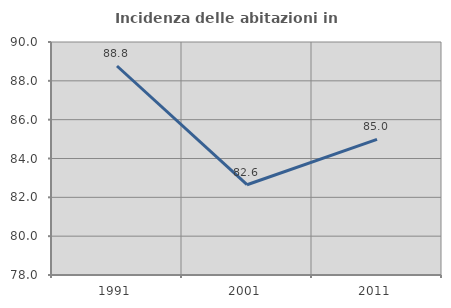
| Category | Incidenza delle abitazioni in proprietà  |
|---|---|
| 1991.0 | 88.764 |
| 2001.0 | 82.649 |
| 2011.0 | 84.982 |